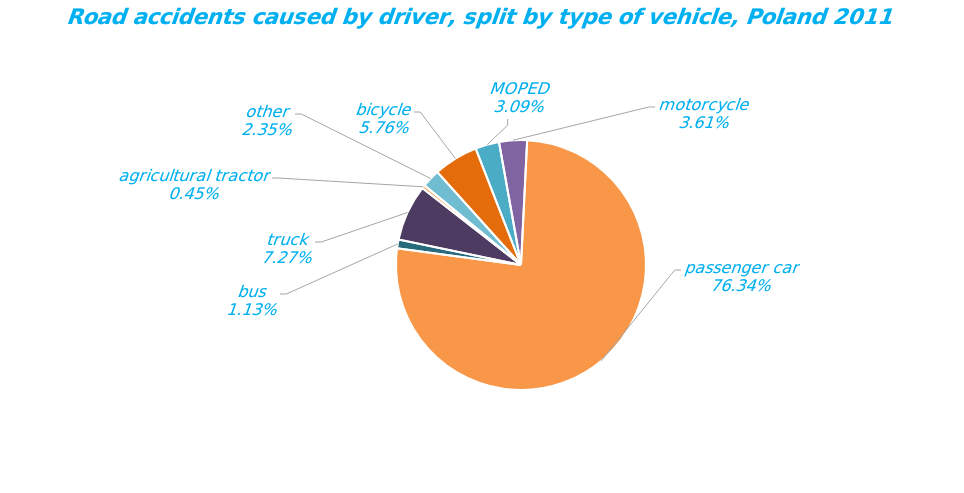
| Category | Series 0 |
|---|---|
| bicycle | 1854 |
| MOPED | 994 |
| motorcycle | 1160 |
| passenger car | 24573 |
| bus | 364 |
| truck | 2341 |
| agricultural tractor | 145 |
| other | 757 |